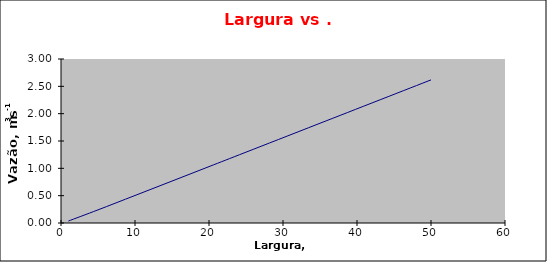
| Category | Vazão, m3s-1 |
|---|---|
| 1.0 | 0.036 |
| 5.0 | 0.24 |
| 10.0 | 0.503 |
| 15.0 | 0.767 |
| 20.0 | 1.031 |
| 25.0 | 1.296 |
| 35.0 | 1.824 |
| 50.0 | 2.618 |